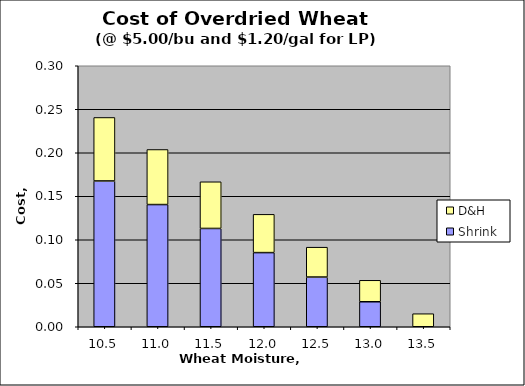
| Category | Shrink | D&H |
|---|---|---|
| 10.5 | 0.168 | 0.073 |
| 11.0 | 0.14 | 0.063 |
| 11.5 | 0.113 | 0.054 |
| 12.0 | 0.085 | 0.044 |
| 12.5 | 0.057 | 0.034 |
| 13.0 | 0.029 | 0.025 |
| 13.5 | 0 | 0.015 |